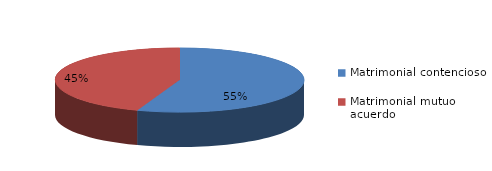
| Category | Series 0 |
|---|---|
| 0 | 668 |
| 1 | 536 |